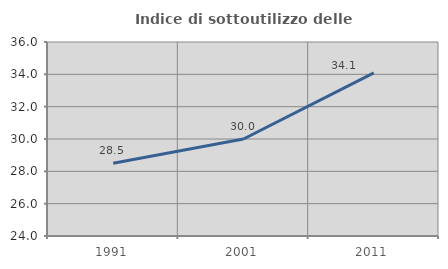
| Category | Indice di sottoutilizzo delle abitazioni  |
|---|---|
| 1991.0 | 28.495 |
| 2001.0 | 30 |
| 2011.0 | 34.093 |